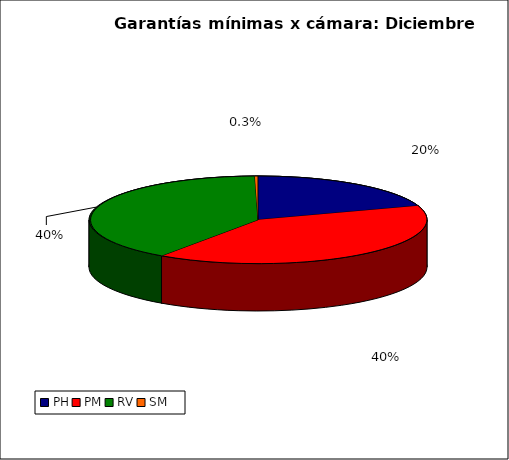
| Category | Series 0 |
|---|---|
| PH | 2344.199 |
| PM | 4706.203 |
| RV | 4730.228 |
| SM | 35.207 |